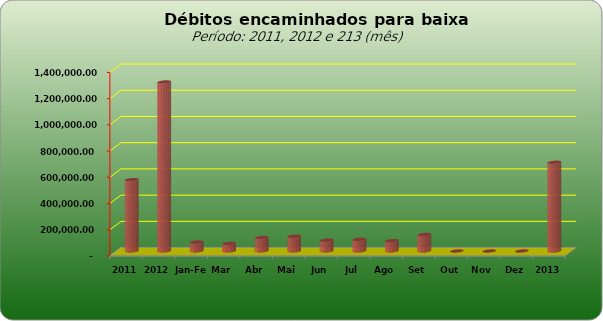
| Category |  543.796,20   1.288.982,12   68.983,48   57.649,63   103.629,52   112.546,24   82.743,05   88.789,93   78.810,72   125.756,48   -     -     -     676.718,40  |
|---|---|
| 2011 | 543796.2 |
| 2012 | 1288982.12 |
| Jan-Fev | 68983.48 |
| Mar | 57649.63 |
| Abr | 103629.52 |
| Mai | 112546.24 |
| Jun | 82743.05 |
| Jul | 88789.93 |
| Ago | 78810.72 |
| Set | 125756.48 |
| Out | 0 |
| Nov | 0 |
| Dez | 0 |
| 2013 | 676718.4 |